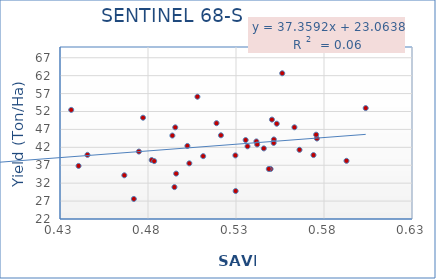
| Category | Series 0 |
|---|---|
| 0.551515 | 44.193 |
| 0.553153 | 48.59 |
| 0.521448 | 45.357 |
| 0.575982 | 44.457 |
| 0.445593 | 39.897 |
| 0.495479 | 47.577 |
| 0.482104 | 38.457 |
| 0.511347 | 39.537 |
| 0.575538 | 45.533 |
| 0.471959 | 27.6 |
| 0.474816 | 40.82 |
| 0.563203 | 47.593 |
| 0.535491 | 44.033 |
| 0.495027 | 30.9 |
| 0.549657 | 36.813 |
| 0.541585 | 35.96 |
| 0.551413 | 43.65 |
| 0.542028 | 43.227 |
| 0.550424 | 42.803 |
| 0.592783 | 49.743 |
| 0.518931 | 38.233 |
| 0.566082 | 48.74 |
| 0.493846 | 41.3 |
| 0.466556 | 45.283 |
| 0.503485 | 34.2 |
| 0.529801 | 40.053 |
| 0.495994 | 37.533 |
| 0.477182 | 29.81 |
| 0.483512 | 34.667 |
| 0.556264 | 50.267 |
| 0.502379 | 38.16 |
| 0.529645 | 39.84 |
| 0.548628 | 62.667 |
| 0.508084 | 42.387 |
| 0.536539 | 39.747 |
| 0.436363 | 35.967 |
| 0.603698 | 56.123 |
| 0.545803 | 42.28 |
| 0.557738 | 52.45 |
| 0.611741 | 52.953 |
| 0.515675 | 41.7 |